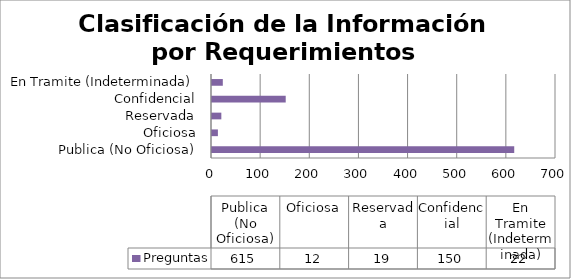
| Category | Preguntas |
|---|---|
| Publica (No Oficiosa) | 615 |
| Oficiosa | 12 |
| Reservada | 19 |
| Confidencial | 150 |
| En Tramite (Indeterminada) | 22 |